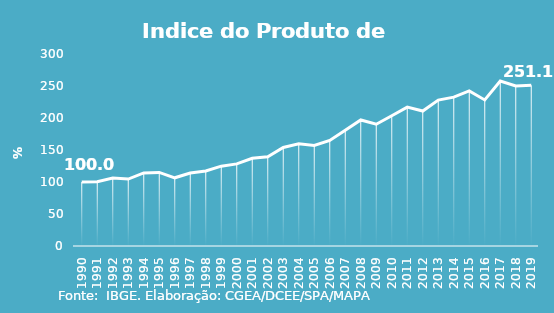
| Category | Indice de Prod. base 1990 |
|---|---|
| 1990.0 | 100 |
| 1991.0 | 100.275 |
| 1992.0 | 106.203 |
| 1993.0 | 104.57 |
| 1994.0 | 114.164 |
| 1995.0 | 115.024 |
| 1996.0 | 106.552 |
| 1997.0 | 114.037 |
| 1998.0 | 117.319 |
| 1999.0 | 124.734 |
| 2000.0 | 128.293 |
| 2001.0 | 136.975 |
| 2002.0 | 139.51 |
| 2003.0 | 153.868 |
| 2004.0 | 159.641 |
| 2005.0 | 157.136 |
| 2006.0 | 164.858 |
| 2007.0 | 180.781 |
| 2008.0 | 196.91 |
| 2009.0 | 190.309 |
| 2010.0 | 203.581 |
| 2011.0 | 217.041 |
| 2012.0 | 210.932 |
| 2013.0 | 228.009 |
| 2014.0 | 232.562 |
| 2015.0 | 242.318 |
| 2016.0 | 228.239 |
| 2017.0 | 257.766 |
| 2018.0 | 250.124 |
| 2019.0 | 251.077 |